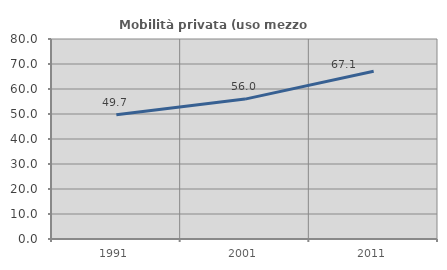
| Category | Mobilità privata (uso mezzo privato) |
|---|---|
| 1991.0 | 49.725 |
| 2001.0 | 55.963 |
| 2011.0 | 67.071 |